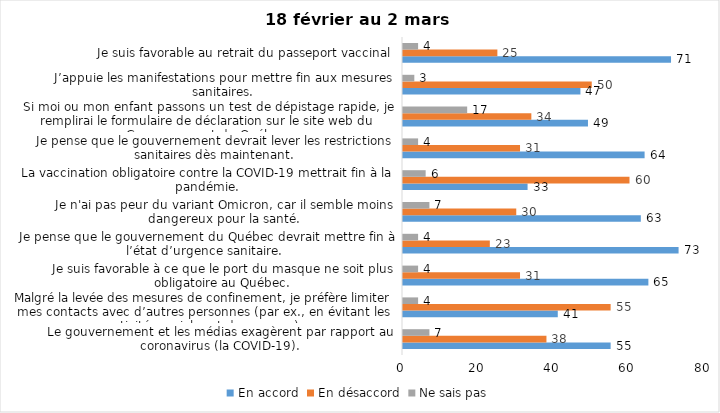
| Category | En accord | En désaccord | Ne sais pas |
|---|---|---|---|
| Le gouvernement et les médias exagèrent par rapport au coronavirus (la COVID-19). | 55 | 38 | 7 |
| Malgré la levée des mesures de confinement, je préfère limiter mes contacts avec d’autres personnes (par ex., en évitant les activités sociales et de groupes) | 41 | 55 | 4 |
| Je suis favorable à ce que le port du masque ne soit plus obligatoire au Québec. | 65 | 31 | 4 |
| Je pense que le gouvernement du Québec devrait mettre fin à l’état d’urgence sanitaire.  | 73 | 23 | 4 |
| Je n'ai pas peur du variant Omicron, car il semble moins dangereux pour la santé. | 63 | 30 | 7 |
| La vaccination obligatoire contre la COVID-19 mettrait fin à la pandémie. | 33 | 60 | 6 |
| Je pense que le gouvernement devrait lever les restrictions sanitaires dès maintenant. | 64 | 31 | 4 |
| Si moi ou mon enfant passons un test de dépistage rapide, je remplirai le formulaire de déclaration sur le site web du Gouvernement du Québec. | 49 | 34 | 17 |
| J’appuie les manifestations pour mettre fin aux mesures sanitaires. | 47 | 50 | 3 |
| Je suis favorable au retrait du passeport vaccinal | 71 | 25 | 4 |